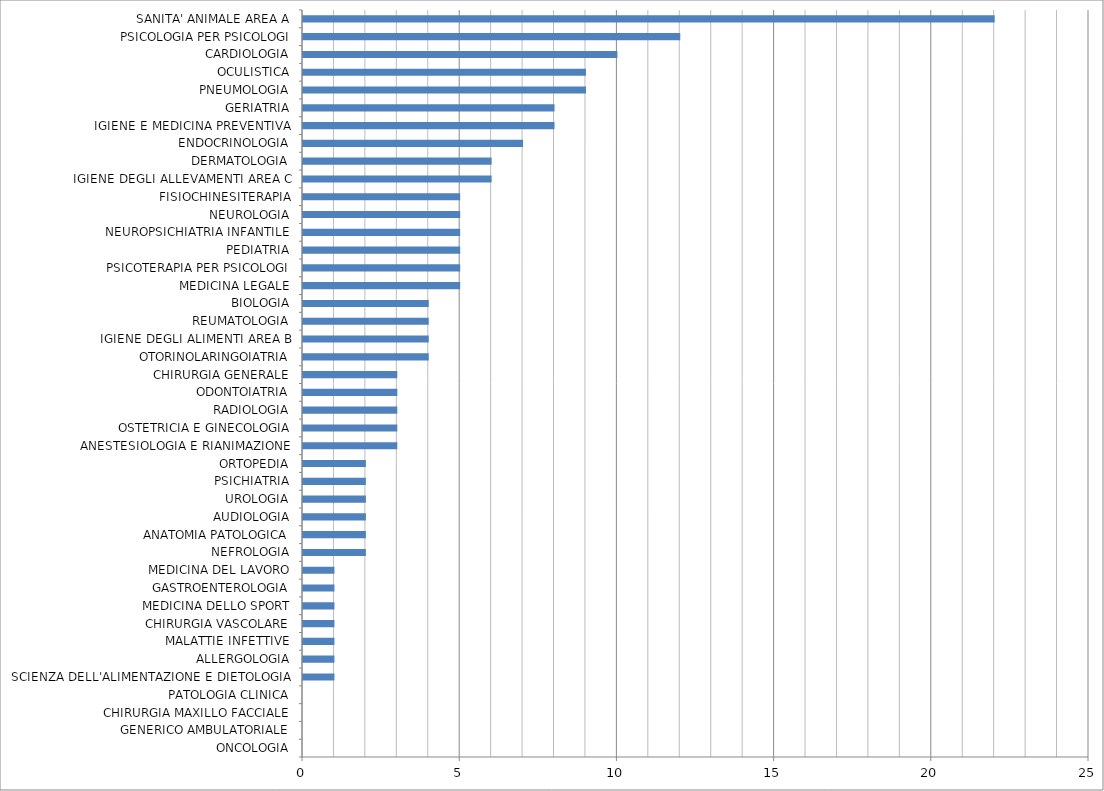
| Category | Series 0 |
|---|---|
| ONCOLOGIA | 0 |
| GENERICO AMBULATORIALE | 0 |
| CHIRURGIA MAXILLO FACCIALE | 0 |
| PATOLOGIA CLINICA | 0 |
| SCIENZA DELL'ALIMENTAZIONE E DIETOLOGIA | 1 |
| ALLERGOLOGIA | 1 |
| MALATTIE INFETTIVE | 1 |
| CHIRURGIA VASCOLARE | 1 |
| MEDICINA DELLO SPORT | 1 |
| GASTROENTEROLOGIA | 1 |
| MEDICINA DEL LAVORO | 1 |
| NEFROLOGIA | 2 |
| ANATOMIA PATOLOGICA | 2 |
| AUDIOLOGIA | 2 |
| UROLOGIA | 2 |
| PSICHIATRIA | 2 |
| ORTOPEDIA | 2 |
| ANESTESIOLOGIA E RIANIMAZIONE | 3 |
| OSTETRICIA E GINECOLOGIA | 3 |
| RADIOLOGIA | 3 |
| ODONTOIATRIA | 3 |
| CHIRURGIA GENERALE | 3 |
| OTORINOLARINGOIATRIA | 4 |
| IGIENE DEGLI ALIMENTI AREA B | 4 |
| REUMATOLOGIA | 4 |
| BIOLOGIA | 4 |
| MEDICINA LEGALE | 5 |
| PSICOTERAPIA PER PSICOLOGI | 5 |
| PEDIATRIA | 5 |
| NEUROPSICHIATRIA INFANTILE | 5 |
| NEUROLOGIA | 5 |
| FISIOCHINESITERAPIA | 5 |
| IGIENE DEGLI ALLEVAMENTI AREA C | 6 |
| DERMATOLOGIA | 6 |
| ENDOCRINOLOGIA | 7 |
| IGIENE E MEDICINA PREVENTIVA | 8 |
| GERIATRIA | 8 |
| PNEUMOLOGIA | 9 |
| OCULISTICA | 9 |
| CARDIOLOGIA | 10 |
| PSICOLOGIA PER PSICOLOGI | 12 |
| SANITA' ANIMALE AREA A | 22 |